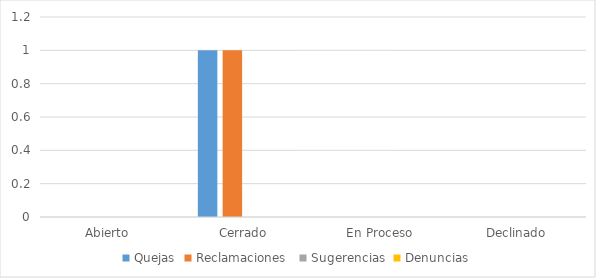
| Category | Quejas | Reclamaciones  | Sugerencias | Denuncias |
|---|---|---|---|---|
| Abierto | 0 | 0 | 0 | 0 |
| Cerrado | 1 | 1 | 0 | 0 |
| En Proceso | 0 | 0 | 0 | 0 |
| Declinado | 0 | 0 | 0 | 0 |